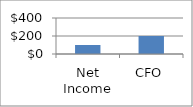
| Category | Series 0 |
|---|---|
| Net Income | 100 |
| CFO | 200 |